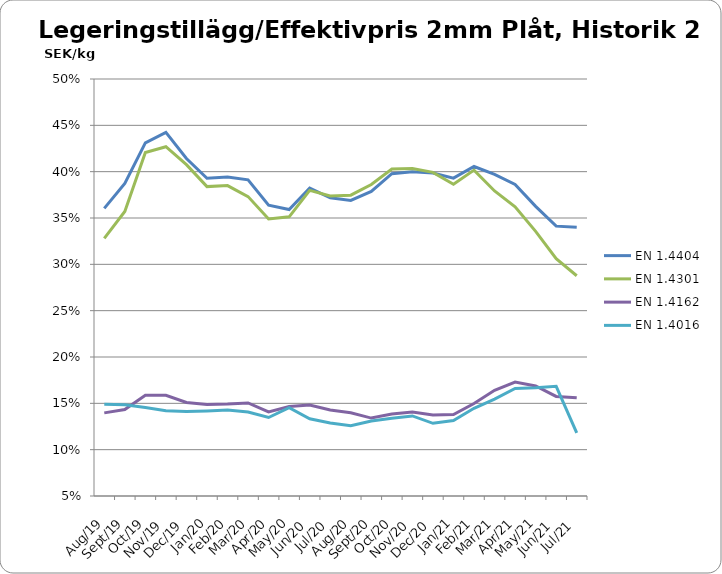
| Category | EN 1.4404 | EN 1.4301 | EN 1.4162  | EN 1.4016 |
|---|---|---|---|---|
| 2019-08-01 | 0.36 | 0.328 | 0.14 | 0.149 |
| 2019-09-01 | 0.387 | 0.357 | 0.143 | 0.149 |
| 2019-10-01 | 0.431 | 0.421 | 0.159 | 0.145 |
| 2019-11-01 | 0.442 | 0.427 | 0.159 | 0.142 |
| 2019-12-01 | 0.414 | 0.408 | 0.151 | 0.141 |
| 2020-01-01 | 0.393 | 0.384 | 0.149 | 0.142 |
| 2020-02-01 | 0.394 | 0.385 | 0.149 | 0.143 |
| 2020-03-01 | 0.391 | 0.373 | 0.15 | 0.141 |
| 2020-04-01 | 0.364 | 0.349 | 0.141 | 0.135 |
| 2020-05-01 | 0.359 | 0.351 | 0.146 | 0.145 |
| 2020-06-01 | 0.382 | 0.38 | 0.148 | 0.133 |
| 2020-07-01 | 0.372 | 0.374 | 0.143 | 0.129 |
| 2020-08-01 | 0.369 | 0.375 | 0.14 | 0.126 |
| 2020-09-01 | 0.379 | 0.386 | 0.134 | 0.131 |
| 2020-10-01 | 0.398 | 0.403 | 0.138 | 0.134 |
| 2020-11-01 | 0.4 | 0.403 | 0.141 | 0.136 |
| 2020-12-01 | 0.399 | 0.399 | 0.137 | 0.128 |
| 2021-01-01 | 0.393 | 0.386 | 0.138 | 0.131 |
| 2021-02-01 | 0.406 | 0.402 | 0.15 | 0.145 |
| 2021-03-01 | 0.397 | 0.379 | 0.164 | 0.155 |
| 2021-04-01 | 0.386 | 0.362 | 0.173 | 0.166 |
| 2021-05-01 | 0.363 | 0.336 | 0.169 | 0.167 |
| 2021-06-01 | 0.341 | 0.306 | 0.157 | 0.168 |
| 2021-07-01 | 0.34 | 0.288 | 0.156 | 0.118 |